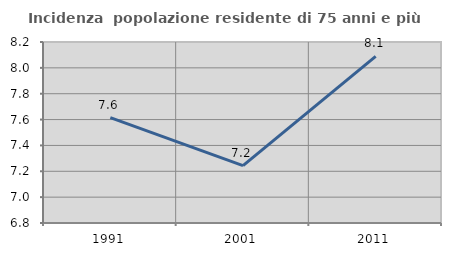
| Category | Incidenza  popolazione residente di 75 anni e più |
|---|---|
| 1991.0 | 7.615 |
| 2001.0 | 7.244 |
| 2011.0 | 8.089 |